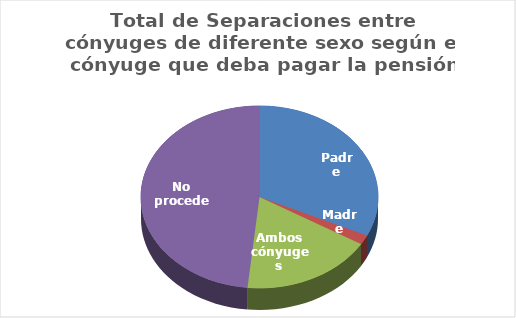
| Category | Series 0 |
|---|---|
| Padre | 1001 |
| Madre | 53 |
| Ambos cónyuges | 562 |
| No procede | 1515 |